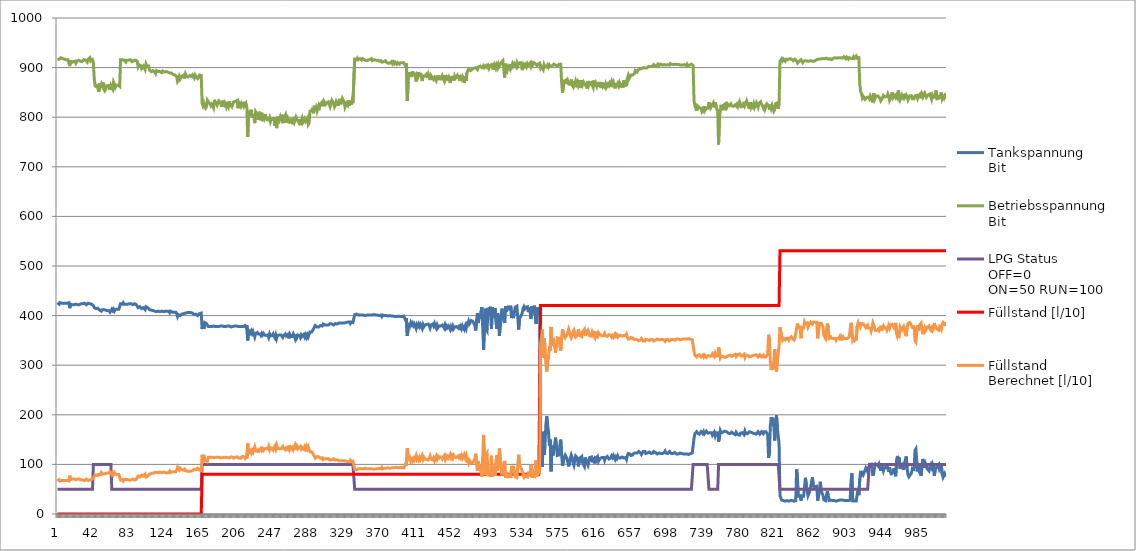
| Category | Tankspannung
Bit | Tank Buffer
Bit | Betriebsspannung
Bit | LPG Status 
OFF=0 
ON=50 RUN=100 | Füllstand [l/10] | Füllstand
Berechnet [l/10] |
|---|---|---|---|---|---|---|
| 0 | 426 |  | 916 | 50 | 0 | 66.474 |
| 1 | 424 |  | 918 | 50 | 0 | 68.422 |
| 2 | 423 |  | 917 | 50 | 0 | 69.413 |
| 3 | 426 |  | 918 | 50 | 0 | 66.458 |
| 4 | 424 |  | 920 | 50 | 0 | 68.406 |
| 5 | 425 |  | 919 | 50 | 0 | 67.432 |
| 6 | 426 |  | 918 | 50 | 0 | 66.458 |
| 7 | 425 |  | 920 | 50 | 0 | 67.424 |
| 8 | 426 |  | 917 | 50 | 0 | 66.466 |
| 9 | 425 |  | 917 | 50 | 0 | 67.448 |
| 10 | 425 |  | 916 | 50 | 0 | 67.456 |
| 11 | 425 |  | 918 | 50 | 0 | 67.44 |
| 12 | 424 |  | 916 | 50 | 0 | 68.439 |
| 13 | 426 |  | 918 | 50 | 0 | 66.458 |
| 14 | 415 |  | 903 | 50 | 0 | 77.384 |
| 15 | 423 |  | 915 | 50 | 0 | 69.429 |
| 16 | 421 |  | 910 | 50 | 0 | 71.435 |
| 17 | 422 |  | 912 | 50 | 0 | 70.436 |
| 18 | 420 |  | 912 | 50 | 0 | 72.4 |
| 19 | 422 |  | 910 | 50 | 0 | 70.453 |
| 20 | 423 |  | 913 | 50 | 0 | 69.446 |
| 21 | 423 |  | 909 | 50 | 0 | 69.479 |
| 22 | 423 |  | 913 | 50 | 0 | 69.446 |
| 23 | 422 |  | 915 | 50 | 0 | 70.411 |
| 24 | 423 |  | 915 | 50 | 0 | 69.429 |
| 25 | 422 |  | 916 | 50 | 0 | 70.403 |
| 26 | 422 |  | 913 | 50 | 0 | 70.428 |
| 27 | 424 |  | 914 | 50 | 0 | 68.455 |
| 28 | 422 |  | 912 | 50 | 0 | 70.436 |
| 29 | 424 |  | 913 | 50 | 0 | 68.463 |
| 30 | 423 |  | 916 | 50 | 0 | 69.421 |
| 31 | 425 |  | 915 | 50 | 0 | 67.465 |
| 32 | 424 |  | 915 | 50 | 0 | 68.447 |
| 33 | 422 |  | 915 | 50 | 0 | 70.411 |
| 34 | 421 |  | 911 | 50 | 0 | 71.426 |
| 35 | 425 |  | 917 | 50 | 0 | 67.448 |
| 36 | 424 |  | 917 | 50 | 0 | 68.43 |
| 37 | 424 |  | 920 | 50 | 0 | 68.406 |
| 38 | 423 |  | 913 | 50 | 0 | 69.446 |
| 39 | 423 |  | 914 | 50 | 0 | 69.437 |
| 40 | 425 |  | 916 | 50 | 0 | 67.456 |
| 41 | 420 |  | 910 | 100 | 0 | 72.417 |
| 42 | 416 |  | 877 | 100 | 0 | 76.621 |
| 43 | 415 |  | 863 | 100 | 0 | 77.722 |
| 44 | 414 |  | 862 | 100 | 0 | 78.713 |
| 45 | 413 |  | 861 | 100 | 0 | 79.703 |
| 46 | 415 |  | 867 | 100 | 0 | 77.688 |
| 47 | 413 |  | 851 | 100 | 0 | 79.788 |
| 48 | 411 |  | 868 | 100 | 0 | 81.608 |
| 49 | 413 |  | 861 | 100 | 0 | 79.703 |
| 50 | 409 |  | 866 | 100 | 0 | 83.589 |
| 51 | 412 |  | 860 | 100 | 0 | 80.694 |
| 52 | 411 |  | 870 | 100 | 0 | 81.591 |
| 53 | 412 |  | 856 | 100 | 0 | 80.728 |
| 54 | 411 |  | 853 | 100 | 0 | 81.736 |
| 55 | 411 |  | 856 | 100 | 0 | 81.71 |
| 56 | 411 |  | 863 | 100 | 0 | 81.651 |
| 57 | 410 |  | 864 | 100 | 0 | 82.624 |
| 58 | 412 |  | 861 | 100 | 0 | 80.686 |
| 59 | 410 |  | 866 | 100 | 0 | 82.607 |
| 60 | 407 |  | 855 | 100 | 0 | 85.647 |
| 61 | 409 |  | 864 | 100 | 0 | 83.606 |
| 62 | 413 |  | 865 | 50 | 0 | 79.669 |
| 63 | 410 |  | 857 | 50 | 0 | 82.684 |
| 64 | 413 |  | 871 | 50 | 0 | 79.619 |
| 65 | 409 |  | 867 | 50 | 0 | 83.581 |
| 66 | 412 |  | 860 | 50 | 0 | 80.694 |
| 67 | 413 |  | 864 | 50 | 0 | 79.678 |
| 68 | 413 |  | 866 | 50 | 0 | 79.661 |
| 69 | 411 |  | 865 | 50 | 0 | 81.634 |
| 70 | 413 |  | 866 | 50 | 0 | 79.661 |
| 71 | 413 |  | 862 | 50 | 0 | 79.695 |
| 72 | 424 |  | 916 | 50 | 0 | 68.439 |
| 73 | 424 |  | 915 | 50 | 0 | 68.447 |
| 74 | 423 |  | 916 | 50 | 0 | 69.421 |
| 75 | 426 |  | 914 | 50 | 0 | 66.491 |
| 76 | 423 |  | 915 | 50 | 0 | 69.429 |
| 77 | 423 |  | 915 | 50 | 0 | 69.429 |
| 78 | 423 |  | 911 | 50 | 0 | 69.462 |
| 79 | 423 |  | 915 | 50 | 0 | 69.429 |
| 80 | 423 |  | 914 | 50 | 0 | 69.437 |
| 81 | 423 |  | 915 | 50 | 0 | 69.429 |
| 82 | 424 |  | 915 | 50 | 0 | 68.447 |
| 83 | 423 |  | 916 | 50 | 0 | 69.421 |
| 84 | 424 |  | 916 | 50 | 0 | 68.439 |
| 85 | 423 |  | 912 | 50 | 0 | 69.454 |
| 86 | 422 |  | 914 | 50 | 0 | 70.419 |
| 87 | 423 |  | 914 | 50 | 0 | 69.437 |
| 88 | 424 |  | 912 | 50 | 0 | 68.472 |
| 89 | 424 |  | 915 | 50 | 0 | 68.447 |
| 90 | 422 |  | 915 | 50 | 0 | 70.411 |
| 91 | 423 |  | 913 | 50 | 0 | 69.446 |
| 92 | 416 |  | 902 | 50 | 0 | 76.411 |
| 93 | 416 |  | 906 | 50 | 0 | 76.377 |
| 94 | 418 |  | 906 | 50 | 0 | 74.414 |
| 95 | 416 |  | 904 | 50 | 0 | 76.394 |
| 96 | 414 |  | 898 | 50 | 0 | 78.408 |
| 97 | 413 |  | 896 | 50 | 0 | 79.407 |
| 98 | 416 |  | 903 | 50 | 0 | 76.403 |
| 99 | 414 |  | 902 | 50 | 0 | 78.374 |
| 100 | 412 |  | 896 | 50 | 0 | 80.388 |
| 101 | 418 |  | 907 | 50 | 0 | 74.406 |
| 102 | 418 |  | 903 | 50 | 0 | 74.439 |
| 103 | 416 |  | 901 | 50 | 0 | 76.419 |
| 104 | 416 |  | 903 | 50 | 0 | 76.403 |
| 105 | 412 |  | 895 | 50 | 0 | 80.397 |
| 106 | 412 |  | 894 | 50 | 0 | 80.405 |
| 107 | 411 |  | 892 | 50 | 0 | 81.404 |
| 108 | 410 |  | 894 | 50 | 0 | 82.368 |
| 109 | 410 |  | 894 | 50 | 0 | 82.368 |
| 110 | 409 |  | 895 | 50 | 0 | 83.341 |
| 111 | 409 |  | 891 | 50 | 0 | 83.375 |
| 112 | 410 |  | 888 | 50 | 0 | 82.42 |
| 113 | 408 |  | 894 | 50 | 0 | 84.331 |
| 114 | 408 |  | 892 | 50 | 0 | 84.348 |
| 115 | 409 |  | 892 | 50 | 0 | 83.367 |
| 116 | 411 |  | 891 | 50 | 0 | 81.412 |
| 117 | 408 |  | 892 | 50 | 0 | 84.348 |
| 118 | 408 |  | 892 | 50 | 0 | 84.348 |
| 119 | 409 |  | 890 | 50 | 0 | 83.384 |
| 120 | 409 |  | 893 | 50 | 0 | 83.358 |
| 121 | 408 |  | 892 | 50 | 0 | 84.348 |
| 122 | 409 |  | 891 | 50 | 0 | 83.375 |
| 123 | 409 |  | 892 | 50 | 0 | 83.367 |
| 124 | 410 |  | 892 | 50 | 0 | 82.385 |
| 125 | 409 |  | 893 | 50 | 0 | 83.358 |
| 126 | 408 |  | 891 | 50 | 0 | 84.357 |
| 127 | 409 |  | 891 | 50 | 0 | 83.375 |
| 128 | 406 |  | 889 | 50 | 0 | 86.336 |
| 129 | 409 |  | 891 | 50 | 0 | 83.375 |
| 130 | 408 |  | 889 | 50 | 0 | 84.374 |
| 131 | 407 |  | 888 | 50 | 0 | 85.364 |
| 132 | 407 |  | 886 | 50 | 0 | 85.381 |
| 133 | 407 |  | 884 | 50 | 0 | 85.398 |
| 134 | 407 |  | 885 | 50 | 0 | 85.389 |
| 135 | 407 |  | 887 | 50 | 0 | 85.372 |
| 136 | 404 |  | 882 | 50 | 0 | 88.359 |
| 137 | 398 |  | 872 | 50 | 0 | 94.332 |
| 138 | 402 |  | 875 | 50 | 0 | 90.382 |
| 139 | 404 |  | 882 | 50 | 0 | 88.359 |
| 140 | 400 |  | 877 | 50 | 0 | 92.326 |
| 141 | 402 |  | 877 | 50 | 0 | 90.364 |
| 142 | 403 |  | 883 | 50 | 0 | 89.331 |
| 143 | 402 |  | 882 | 50 | 0 | 90.321 |
| 144 | 404 |  | 885 | 50 | 0 | 88.333 |
| 145 | 402 |  | 878 | 50 | 0 | 90.356 |
| 146 | 405 |  | 887 | 50 | 0 | 87.335 |
| 147 | 403 |  | 883 | 50 | 0 | 89.331 |
| 148 | 406 |  | 885 | 50 | 0 | 86.371 |
| 149 | 405 |  | 881 | 50 | 0 | 87.386 |
| 150 | 406 |  | 882 | 50 | 0 | 86.397 |
| 151 | 405 |  | 884 | 50 | 0 | 87.36 |
| 152 | 406 |  | 883 | 50 | 0 | 86.388 |
| 153 | 404 |  | 882 | 50 | 0 | 88.359 |
| 154 | 405 |  | 885 | 50 | 0 | 87.352 |
| 155 | 403 |  | 884 | 50 | 0 | 89.323 |
| 156 | 402 |  | 879 | 50 | 0 | 90.347 |
| 157 | 402 |  | 885 | 50 | 0 | 90.295 |
| 158 | 403 |  | 882 | 50 | 0 | 89.34 |
| 159 | 402 |  | 882 | 50 | 0 | 90.321 |
| 160 | 400 |  | 878 | 50 | 0 | 92.317 |
| 161 | 401 |  | 881 | 50 | 0 | 91.31 |
| 162 | 404 |  | 885 | 50 | 0 | 88.333 |
| 163 | 404 |  | 885 | 50 | 0 | 88.333 |
| 164 | 405 |  | 884 | 50 | 0 | 87.36 |
| 165 | 373 |  | 828 | 100 | 80.3 | 119.231 |
| 166 | 387 |  | 823 | 100 | 80.3 | 105.557 |
| 167 | 373 |  | 828 | 100 | 80.3 | 119.231 |
| 168 | 386 |  | 821 | 100 | 80.3 | 106.556 |
| 169 | 386 |  | 818 | 100 | 80.3 | 106.583 |
| 170 | 384 |  | 821 | 100 | 80.3 | 108.517 |
| 171 | 386 |  | 834 | 100 | 80.3 | 106.438 |
| 172 | 378 |  | 831 | 100 | 80.3 | 114.306 |
| 173 | 377 |  | 830 | 100 | 80.3 | 115.294 |
| 174 | 378 |  | 827 | 100 | 80.3 | 114.343 |
| 175 | 378 |  | 823 | 100 | 80.3 | 114.38 |
| 176 | 378 |  | 826 | 100 | 80.3 | 114.352 |
| 177 | 379 |  | 823 | 100 | 80.3 | 113.4 |
| 178 | 379 |  | 819 | 100 | 80.3 | 113.437 |
| 179 | 379 |  | 835 | 100 | 80.3 | 113.289 |
| 180 | 378 |  | 830 | 100 | 80.3 | 114.315 |
| 181 | 377 |  | 829 | 100 | 80.3 | 115.304 |
| 182 | 378 |  | 824 | 100 | 80.3 | 114.37 |
| 183 | 378 |  | 823 | 100 | 80.3 | 114.38 |
| 184 | 378 |  | 833 | 100 | 80.3 | 114.287 |
| 185 | 378 |  | 833 | 100 | 80.3 | 114.287 |
| 186 | 379 |  | 830 | 100 | 80.3 | 113.335 |
| 187 | 378 |  | 821 | 100 | 80.3 | 114.398 |
| 188 | 379 |  | 831 | 100 | 80.3 | 113.326 |
| 189 | 379 |  | 829 | 100 | 80.3 | 113.344 |
| 190 | 378 |  | 832 | 100 | 80.3 | 114.296 |
| 191 | 379 |  | 820 | 100 | 80.3 | 113.427 |
| 192 | 378 |  | 831 | 100 | 80.3 | 114.306 |
| 193 | 379 |  | 821 | 100 | 80.3 | 113.418 |
| 194 | 379 |  | 825 | 100 | 80.3 | 113.381 |
| 195 | 380 |  | 821 | 100 | 80.3 | 112.438 |
| 196 | 379 |  | 832 | 100 | 80.3 | 113.317 |
| 197 | 379 |  | 826 | 100 | 80.3 | 113.372 |
| 198 | 377 |  | 824 | 100 | 80.3 | 115.35 |
| 199 | 379 |  | 821 | 100 | 80.3 | 113.418 |
| 200 | 378 |  | 823 | 100 | 80.3 | 114.38 |
| 201 | 380 |  | 831 | 100 | 80.3 | 112.346 |
| 202 | 379 |  | 832 | 100 | 80.3 | 113.317 |
| 203 | 378 |  | 832 | 100 | 80.3 | 114.296 |
| 204 | 379 |  | 833 | 100 | 80.3 | 113.307 |
| 205 | 377 |  | 834 | 100 | 80.3 | 115.257 |
| 206 | 378 |  | 818 | 100 | 80.3 | 114.426 |
| 207 | 380 |  | 829 | 100 | 80.3 | 112.364 |
| 208 | 378 |  | 828 | 100 | 80.3 | 114.333 |
| 209 | 380 |  | 822 | 100 | 80.3 | 112.429 |
| 210 | 378 |  | 828 | 100 | 80.3 | 114.333 |
| 211 | 376 |  | 829 | 100 | 80.3 | 116.283 |
| 212 | 378 |  | 822 | 100 | 80.3 | 114.389 |
| 213 | 377 |  | 831 | 100 | 80.3 | 115.285 |
| 214 | 380 |  | 825 | 100 | 80.3 | 112.401 |
| 215 | 377 |  | 828 | 100 | 80.3 | 115.313 |
| 216 | 381 |  | 821 | 100 | 80.3 | 111.458 |
| 217 | 350 |  | 760 | 100 | 80.3 | 142.4 |
| 218 | 370 |  | 806 | 100 | 80.3 | 122.376 |
| 219 | 371 |  | 813 | 100 | 80.3 | 121.33 |
| 220 | 365 |  | 803 | 100 | 80.3 | 127.3 |
| 221 | 369 |  | 815 | 100 | 80.3 | 123.27 |
| 222 | 364 |  | 802 | 100 | 80.3 | 128.288 |
| 223 | 368 |  | 800 | 100 | 80.3 | 124.391 |
| 224 | 367 |  | 803 | 100 | 80.3 | 125.342 |
| 225 | 357 |  | 788 | 100 | 80.3 | 135.275 |
| 226 | 364 |  | 811 | 100 | 80.3 | 128.202 |
| 227 | 362 |  | 808 | 100 | 80.3 | 130.188 |
| 228 | 366 |  | 805 | 100 | 80.3 | 126.302 |
| 229 | 363 |  | 795 | 100 | 80.3 | 129.335 |
| 230 | 365 |  | 811 | 100 | 80.3 | 127.223 |
| 231 | 363 |  | 809 | 100 | 80.3 | 129.2 |
| 232 | 360 |  | 794 | 100 | 80.3 | 132.281 |
| 233 | 364 |  | 809 | 100 | 80.3 | 128.221 |
| 234 | 361 |  | 792 | 100 | 80.3 | 131.321 |
| 235 | 364 |  | 805 | 100 | 80.3 | 128.26 |
| 236 | 361 |  | 799 | 100 | 80.3 | 131.253 |
| 237 | 361 |  | 806 | 100 | 80.3 | 131.186 |
| 238 | 360 |  | 798 | 100 | 80.3 | 132.242 |
| 239 | 361 |  | 795 | 100 | 80.3 | 131.292 |
| 240 | 361 |  | 797 | 100 | 80.3 | 131.273 |
| 241 | 356 |  | 794 | 100 | 80.3 | 136.194 |
| 242 | 363 |  | 799 | 100 | 80.3 | 129.296 |
| 243 | 359 |  | 791 | 100 | 80.3 | 133.288 |
| 244 | 360 |  | 796 | 100 | 80.3 | 132.261 |
| 245 | 360 |  | 797 | 100 | 80.3 | 132.251 |
| 246 | 363 |  | 796 | 100 | 80.3 | 129.325 |
| 247 | 358 |  | 800 | 100 | 80.3 | 134.179 |
| 248 | 355 |  | 783 | 100 | 80.3 | 137.28 |
| 249 | 361 |  | 800 | 100 | 80.3 | 131.244 |
| 250 | 354 |  | 778 | 100 | 80.3 | 138.308 |
| 251 | 360 |  | 801 | 100 | 80.3 | 132.212 |
| 252 | 360 |  | 788 | 100 | 80.3 | 132.339 |
| 253 | 361 |  | 794 | 100 | 80.3 | 131.302 |
| 254 | 359 |  | 800 | 100 | 80.3 | 133.201 |
| 255 | 361 |  | 793 | 100 | 80.3 | 131.312 |
| 256 | 360 |  | 805 | 100 | 80.3 | 132.174 |
| 257 | 356 |  | 788 | 100 | 80.3 | 136.253 |
| 258 | 360 |  | 796 | 100 | 80.3 | 132.261 |
| 259 | 358 |  | 798 | 100 | 80.3 | 134.198 |
| 260 | 363 |  | 804 | 100 | 80.3 | 129.248 |
| 261 | 359 |  | 789 | 100 | 80.3 | 133.308 |
| 262 | 360 |  | 801 | 100 | 80.3 | 132.212 |
| 263 | 362 |  | 798 | 100 | 80.3 | 130.285 |
| 264 | 354 |  | 790 | 100 | 80.3 | 138.189 |
| 265 | 362 |  | 792 | 100 | 80.3 | 130.343 |
| 266 | 358 |  | 790 | 100 | 80.3 | 134.277 |
| 267 | 360 |  | 798 | 100 | 80.3 | 132.242 |
| 268 | 358 |  | 786 | 100 | 80.3 | 134.316 |
| 269 | 363 |  | 793 | 100 | 80.3 | 129.354 |
| 270 | 359 |  | 789 | 100 | 80.3 | 133.308 |
| 271 | 354 |  | 791 | 100 | 80.3 | 138.179 |
| 272 | 362 |  | 800 | 100 | 80.3 | 130.265 |
| 273 | 356 |  | 796 | 100 | 80.3 | 136.174 |
| 274 | 361 |  | 797 | 100 | 80.3 | 131.273 |
| 275 | 359 |  | 790 | 100 | 80.3 | 133.298 |
| 276 | 360 |  | 796 | 100 | 80.3 | 132.261 |
| 277 | 356 |  | 784 | 100 | 80.3 | 136.292 |
| 278 | 361 |  | 793 | 100 | 80.3 | 131.312 |
| 279 | 358 |  | 798 | 100 | 80.3 | 134.198 |
| 280 | 358 |  | 790 | 100 | 80.3 | 134.277 |
| 281 | 362 |  | 788 | 100 | 80.3 | 130.381 |
| 282 | 357 |  | 797 | 100 | 80.3 | 135.186 |
| 283 | 361 |  | 792 | 100 | 80.3 | 131.321 |
| 284 | 356 |  | 793 | 100 | 80.3 | 136.204 |
| 285 | 361 |  | 798 | 100 | 80.3 | 131.263 |
| 286 | 357 |  | 785 | 100 | 80.3 | 135.304 |
| 287 | 358 |  | 788 | 100 | 80.3 | 134.296 |
| 288 | 367 |  | 812 | 100 | 80.3 | 125.256 |
| 289 | 368 |  | 813 | 100 | 80.3 | 124.268 |
| 290 | 367 |  | 813 | 100 | 80.3 | 125.247 |
| 291 | 370 |  | 819 | 100 | 80.3 | 122.253 |
| 292 | 373 |  | 808 | 100 | 80.3 | 119.418 |
| 293 | 374 |  | 823 | 100 | 80.3 | 118.298 |
| 294 | 380 |  | 813 | 100 | 80.3 | 112.512 |
| 295 | 378 |  | 819 | 100 | 80.3 | 114.417 |
| 296 | 377 |  | 812 | 100 | 80.3 | 115.462 |
| 297 | 379 |  | 818 | 100 | 80.3 | 113.446 |
| 298 | 377 |  | 824 | 100 | 80.3 | 115.35 |
| 299 | 379 |  | 820 | 100 | 80.3 | 113.427 |
| 300 | 380 |  | 827 | 100 | 80.3 | 112.383 |
| 301 | 379 |  | 825 | 100 | 80.3 | 113.381 |
| 302 | 379 |  | 831 | 100 | 80.3 | 113.326 |
| 303 | 383 |  | 822 | 100 | 80.3 | 109.488 |
| 304 | 381 |  | 832 | 100 | 80.3 | 111.357 |
| 305 | 381 |  | 829 | 100 | 80.3 | 111.385 |
| 306 | 382 |  | 826 | 100 | 80.3 | 110.432 |
| 307 | 381 |  | 829 | 100 | 80.3 | 111.385 |
| 308 | 381 |  | 827 | 100 | 80.3 | 111.403 |
| 309 | 381 |  | 831 | 100 | 80.3 | 111.366 |
| 310 | 383 |  | 826 | 100 | 80.3 | 109.452 |
| 311 | 384 |  | 821 | 100 | 80.3 | 108.517 |
| 312 | 383 |  | 827 | 100 | 80.3 | 109.443 |
| 313 | 383 |  | 834 | 100 | 80.3 | 109.379 |
| 314 | 384 |  | 832 | 100 | 80.3 | 108.417 |
| 315 | 381 |  | 828 | 100 | 80.3 | 111.394 |
| 316 | 383 |  | 821 | 100 | 80.3 | 109.497 |
| 317 | 384 |  | 825 | 100 | 80.3 | 108.48 |
| 318 | 382 |  | 832 | 100 | 80.3 | 110.377 |
| 319 | 383 |  | 829 | 100 | 80.3 | 109.424 |
| 320 | 383 |  | 823 | 100 | 80.3 | 109.479 |
| 321 | 385 |  | 831 | 100 | 80.3 | 107.445 |
| 322 | 383 |  | 837 | 100 | 80.3 | 109.351 |
| 323 | 385 |  | 826 | 100 | 80.3 | 107.491 |
| 324 | 386 |  | 824 | 100 | 80.3 | 106.528 |
| 325 | 385 |  | 838 | 100 | 80.3 | 107.382 |
| 326 | 386 |  | 836 | 100 | 80.3 | 106.42 |
| 327 | 385 |  | 831 | 100 | 80.3 | 107.445 |
| 328 | 387 |  | 820 | 100 | 80.3 | 105.584 |
| 329 | 386 |  | 824 | 100 | 80.3 | 106.528 |
| 330 | 387 |  | 828 | 100 | 80.3 | 105.512 |
| 331 | 387 |  | 825 | 100 | 80.3 | 105.539 |
| 332 | 385 |  | 834 | 100 | 80.3 | 107.418 |
| 333 | 387 |  | 823 | 100 | 80.3 | 105.557 |
| 334 | 384 |  | 833 | 100 | 80.3 | 108.408 |
| 335 | 387 |  | 825 | 100 | 80.3 | 105.539 |
| 336 | 385 |  | 833 | 100 | 80.3 | 107.427 |
| 337 | 386 |  | 828 | 100 | 80.3 | 106.492 |
| 338 | 386 |  | 830 | 100 | 80.3 | 106.474 |
| 339 | 402 |  | 917 | 50 | 80.3 | 90.016 |
| 340 | 401 |  | 918 | 50 | 80.3 | 90.988 |
| 341 | 403 |  | 916 | 50 | 80.3 | 89.045 |
| 342 | 403 |  | 919 | 50 | 80.3 | 89.019 |
| 343 | 401 |  | 916 | 50 | 80.3 | 91.005 |
| 344 | 401 |  | 917 | 50 | 80.3 | 90.996 |
| 345 | 401 |  | 918 | 50 | 80.3 | 90.988 |
| 346 | 401 |  | 916 | 50 | 80.3 | 91.005 |
| 347 | 401 |  | 915 | 50 | 80.3 | 91.014 |
| 348 | 401 |  | 918 | 50 | 80.3 | 90.988 |
| 349 | 401 |  | 918 | 50 | 80.3 | 90.988 |
| 350 | 401 |  | 916 | 50 | 80.3 | 91.005 |
| 351 | 400 |  | 916 | 50 | 80.3 | 91.985 |
| 352 | 400 |  | 914 | 50 | 80.3 | 92.002 |
| 353 | 401 |  | 915 | 50 | 80.3 | 91.014 |
| 354 | 401 |  | 915 | 50 | 80.3 | 91.014 |
| 355 | 401 |  | 914 | 50 | 80.3 | 91.022 |
| 356 | 401 |  | 916 | 50 | 80.3 | 91.005 |
| 357 | 401 |  | 916 | 50 | 80.3 | 91.005 |
| 358 | 400 |  | 918 | 50 | 80.3 | 91.967 |
| 359 | 401 |  | 914 | 50 | 80.3 | 91.022 |
| 360 | 400 |  | 915 | 50 | 80.3 | 91.994 |
| 361 | 402 |  | 916 | 50 | 80.3 | 90.025 |
| 362 | 400 |  | 917 | 50 | 80.3 | 91.976 |
| 363 | 401 |  | 915 | 50 | 80.3 | 91.014 |
| 364 | 401 |  | 915 | 50 | 80.3 | 91.014 |
| 365 | 401 |  | 915 | 50 | 80.3 | 91.014 |
| 366 | 401 |  | 914 | 50 | 80.3 | 91.022 |
| 367 | 400 |  | 913 | 50 | 80.3 | 92.011 |
| 368 | 400 |  | 915 | 50 | 80.3 | 91.994 |
| 369 | 401 |  | 914 | 50 | 80.3 | 91.022 |
| 370 | 398 |  | 911 | 50 | 80.3 | 93.989 |
| 371 | 401 |  | 913 | 50 | 80.3 | 91.031 |
| 372 | 400 |  | 912 | 50 | 80.3 | 92.02 |
| 373 | 400 |  | 911 | 50 | 80.3 | 92.029 |
| 374 | 399 |  | 914 | 50 | 80.3 | 92.982 |
| 375 | 400 |  | 911 | 50 | 80.3 | 92.029 |
| 376 | 400 |  | 910 | 50 | 80.3 | 92.038 |
| 377 | 399 |  | 909 | 50 | 80.3 | 93.026 |
| 378 | 398 |  | 911 | 50 | 80.3 | 93.989 |
| 379 | 400 |  | 909 | 50 | 80.3 | 92.046 |
| 380 | 400 |  | 910 | 50 | 80.3 | 92.038 |
| 381 | 399 |  | 912 | 50 | 80.3 | 93 |
| 382 | 400 |  | 908 | 50 | 80.3 | 92.055 |
| 383 | 399 |  | 911 | 50 | 80.3 | 93.009 |
| 384 | 398 |  | 908 | 50 | 80.3 | 94.015 |
| 385 | 398 |  | 911 | 50 | 80.3 | 93.989 |
| 386 | 398 |  | 909 | 50 | 80.3 | 94.006 |
| 387 | 398 |  | 907 | 50 | 80.3 | 94.024 |
| 388 | 400 |  | 910 | 50 | 80.3 | 92.038 |
| 389 | 399 |  | 910 | 50 | 80.3 | 93.018 |
| 390 | 397 |  | 907 | 50 | 80.3 | 95.004 |
| 391 | 398 |  | 910 | 50 | 80.3 | 93.997 |
| 392 | 398 |  | 909 | 50 | 80.3 | 94.006 |
| 393 | 398 |  | 910 | 50 | 80.3 | 93.997 |
| 394 | 397 |  | 909 | 50 | 80.3 | 94.986 |
| 395 | 399 |  | 910 | 50 | 80.3 | 93.018 |
| 396 | 395 |  | 910 | 50 | 80.3 | 96.937 |
| 397 | 391 |  | 903 | 50 | 80.3 | 100.917 |
| 398 | 395 |  | 909 | 50 | 80.3 | 96.946 |
| 399 | 359 |  | 833 | 50 | 80.3 | 132.879 |
| 400 | 374 |  | 871 | 50 | 80.3 | 117.849 |
| 401 | 385 |  | 891 | 50 | 80.3 | 106.9 |
| 402 | 380 |  | 882 | 50 | 80.3 | 111.876 |
| 403 | 386 |  | 889 | 50 | 80.3 | 105.939 |
| 404 | 382 |  | 881 | 50 | 80.3 | 109.928 |
| 405 | 385 |  | 892 | 50 | 80.3 | 106.891 |
| 406 | 380 |  | 887 | 50 | 80.3 | 111.83 |
| 407 | 383 |  | 886 | 50 | 80.3 | 108.903 |
| 408 | 383 |  | 887 | 50 | 80.3 | 108.894 |
| 409 | 374 |  | 872 | 50 | 80.3 | 117.84 |
| 410 | 382 |  | 885 | 50 | 80.3 | 109.891 |
| 411 | 379 |  | 882 | 50 | 80.3 | 112.855 |
| 412 | 383 |  | 891 | 50 | 80.3 | 108.858 |
| 413 | 378 |  | 881 | 50 | 80.3 | 113.843 |
| 414 | 382 |  | 889 | 50 | 80.3 | 109.855 |
| 415 | 378 |  | 882 | 50 | 80.3 | 113.833 |
| 416 | 374 |  | 873 | 50 | 80.3 | 117.83 |
| 417 | 382 |  | 883 | 50 | 80.3 | 109.91 |
| 418 | 378 |  | 883 | 50 | 80.3 | 113.824 |
| 419 | 381 |  | 883 | 50 | 80.3 | 110.888 |
| 420 | 380 |  | 882 | 50 | 80.3 | 111.876 |
| 421 | 382 |  | 887 | 50 | 80.3 | 109.873 |
| 422 | 382 |  | 879 | 50 | 80.3 | 109.946 |
| 423 | 383 |  | 886 | 50 | 80.3 | 108.903 |
| 424 | 380 |  | 886 | 50 | 80.3 | 111.839 |
| 425 | 375 |  | 875 | 50 | 80.3 | 116.833 |
| 426 | 381 |  | 884 | 50 | 80.3 | 110.879 |
| 427 | 380 |  | 881 | 50 | 80.3 | 111.886 |
| 428 | 383 |  | 882 | 50 | 80.3 | 108.94 |
| 429 | 379 |  | 876 | 50 | 80.3 | 112.91 |
| 430 | 384 |  | 880 | 50 | 80.3 | 107.979 |
| 431 | 379 |  | 878 | 50 | 80.3 | 112.892 |
| 432 | 375 |  | 874 | 50 | 80.3 | 116.843 |
| 433 | 381 |  | 884 | 50 | 80.3 | 110.879 |
| 434 | 376 |  | 876 | 50 | 80.3 | 115.846 |
| 435 | 379 |  | 884 | 50 | 80.3 | 112.836 |
| 436 | 377 |  | 877 | 50 | 80.3 | 114.858 |
| 437 | 379 |  | 879 | 50 | 80.3 | 112.883 |
| 438 | 377 |  | 877 | 50 | 80.3 | 114.858 |
| 439 | 381 |  | 883 | 50 | 80.3 | 110.888 |
| 440 | 381 |  | 885 | 50 | 80.3 | 110.87 |
| 441 | 375 |  | 874 | 50 | 80.3 | 116.843 |
| 442 | 381 |  | 885 | 50 | 80.3 | 110.87 |
| 443 | 375 |  | 877 | 50 | 80.3 | 116.815 |
| 444 | 379 |  | 881 | 50 | 80.3 | 112.864 |
| 445 | 376 |  | 878 | 50 | 80.3 | 115.827 |
| 446 | 379 |  | 881 | 50 | 80.3 | 112.864 |
| 447 | 376 |  | 875 | 50 | 80.3 | 115.855 |
| 448 | 372 |  | 869 | 50 | 80.3 | 119.824 |
| 449 | 378 |  | 883 | 50 | 80.3 | 113.824 |
| 450 | 374 |  | 876 | 50 | 80.3 | 117.802 |
| 451 | 379 |  | 883 | 50 | 80.3 | 112.846 |
| 452 | 374 |  | 874 | 50 | 80.3 | 117.821 |
| 453 | 377 |  | 883 | 50 | 80.3 | 114.802 |
| 454 | 375 |  | 879 | 50 | 80.3 | 116.796 |
| 455 | 378 |  | 881 | 50 | 80.3 | 113.843 |
| 456 | 379 |  | 884 | 50 | 80.3 | 112.836 |
| 457 | 375 |  | 877 | 50 | 80.3 | 116.815 |
| 458 | 378 |  | 885 | 50 | 80.3 | 113.806 |
| 459 | 375 |  | 873 | 50 | 80.3 | 116.852 |
| 460 | 379 |  | 880 | 50 | 80.3 | 112.873 |
| 461 | 374 |  | 877 | 50 | 80.3 | 117.793 |
| 462 | 379 |  | 882 | 50 | 80.3 | 112.855 |
| 463 | 377 |  | 878 | 50 | 80.3 | 114.849 |
| 464 | 372 |  | 869 | 50 | 80.3 | 119.824 |
| 465 | 378 |  | 883 | 50 | 80.3 | 113.824 |
| 466 | 374 |  | 873 | 50 | 80.3 | 117.83 |
| 467 | 388 |  | 890 | 50 | 80.3 | 103.972 |
| 468 | 383 |  | 889 | 50 | 80.3 | 108.876 |
| 469 | 389 |  | 897 | 50 | 80.3 | 102.929 |
| 470 | 384 |  | 895 | 50 | 80.3 | 107.842 |
| 471 | 384 |  | 894 | 50 | 80.3 | 107.852 |
| 472 | 390 |  | 896 | 50 | 80.3 | 101.959 |
| 473 | 389 |  | 897 | 50 | 80.3 | 102.929 |
| 474 | 388 |  | 897 | 50 | 80.3 | 103.909 |
| 475 | 390 |  | 899 | 50 | 80.3 | 101.932 |
| 476 | 380 |  | 897 | 50 | 80.3 | 111.738 |
| 477 | 370 |  | 900 | 50 | 80.3 | 121.486 |
| 478 | 391 |  | 899 | 50 | 80.3 | 100.953 |
| 479 | 405 |  | 896 | 50 | 80.3 | 87.257 |
| 480 | 385 |  | 901 | 50 | 80.3 | 106.809 |
| 481 | 400 |  | 901 | 50 | 80.3 | 92.116 |
| 482 | 394 |  | 903 | 50 | 80.3 | 97.978 |
| 483 | 395 |  | 905 | 50 | 80.3 | 96.981 |
| 484 | 417 |  | 900 | 50 | 80.3 | 75.446 |
| 485 | 379 |  | 901 | 50 | 80.3 | 112.679 |
| 486 | 331 |  | 904 | 50 | 80.3 | 159.441 |
| 487 | 380 |  | 900 | 50 | 80.3 | 111.711 |
| 488 | 414 |  | 901 | 50 | 80.3 | 78.383 |
| 489 | 372 |  | 904 | 50 | 80.3 | 119.495 |
| 490 | 369 |  | 901 | 50 | 80.3 | 122.454 |
| 491 | 416 |  | 904 | 50 | 80.3 | 76.394 |
| 492 | 416 |  | 899 | 50 | 80.3 | 76.436 |
| 493 | 408 |  | 904 | 50 | 80.3 | 84.245 |
| 494 | 418 |  | 905 | 50 | 80.3 | 74.422 |
| 495 | 374 |  | 906 | 50 | 80.3 | 117.521 |
| 496 | 417 |  | 901 | 50 | 80.3 | 75.438 |
| 497 | 417 |  | 904 | 50 | 80.3 | 75.412 |
| 498 | 397 |  | 896 | 50 | 80.3 | 95.101 |
| 499 | 415 |  | 904 | 50 | 80.3 | 77.376 |
| 500 | 416 |  | 899 | 50 | 80.3 | 76.436 |
| 501 | 373 |  | 905 | 50 | 80.3 | 118.508 |
| 502 | 405 |  | 900 | 50 | 80.3 | 87.222 |
| 503 | 396 |  | 907 | 50 | 80.3 | 95.984 |
| 504 | 359 |  | 903 | 50 | 80.3 | 132.196 |
| 505 | 360 |  | 905 | 50 | 80.3 | 131.201 |
| 506 | 400 |  | 910 | 50 | 80.3 | 92.038 |
| 507 | 414 |  | 912 | 50 | 80.3 | 78.29 |
| 508 | 397 |  | 914 | 50 | 80.3 | 94.942 |
| 509 | 397 |  | 914 | 50 | 80.3 | 94.942 |
| 510 | 385 |  | 880 | 50 | 80.3 | 107 |
| 511 | 419 |  | 908 | 50 | 80.3 | 73.415 |
| 512 | 408 |  | 887 | 50 | 80.3 | 84.391 |
| 513 | 413 |  | 899 | 50 | 80.3 | 79.381 |
| 514 | 417 |  | 903 | 50 | 80.3 | 75.421 |
| 515 | 418 |  | 904 | 50 | 80.3 | 74.431 |
| 516 | 414 |  | 897 | 50 | 80.3 | 78.417 |
| 517 | 420 |  | 907 | 50 | 80.3 | 72.442 |
| 518 | 395 |  | 902 | 50 | 80.3 | 97.008 |
| 519 | 408 |  | 908 | 50 | 80.3 | 84.211 |
| 520 | 395 |  | 904 | 50 | 80.3 | 96.99 |
| 521 | 407 |  | 908 | 50 | 80.3 | 85.192 |
| 522 | 417 |  | 905 | 50 | 80.3 | 75.404 |
| 523 | 415 |  | 902 | 50 | 80.3 | 77.393 |
| 524 | 419 |  | 909 | 50 | 80.3 | 73.407 |
| 525 | 417 |  | 903 | 50 | 80.3 | 75.421 |
| 526 | 372 |  | 907 | 50 | 80.3 | 119.466 |
| 527 | 394 |  | 910 | 50 | 80.3 | 97.916 |
| 528 | 397 |  | 908 | 50 | 80.3 | 94.995 |
| 529 | 397 |  | 910 | 50 | 80.3 | 94.977 |
| 530 | 405 |  | 895 | 50 | 80.3 | 87.265 |
| 531 | 414 |  | 901 | 50 | 80.3 | 78.383 |
| 532 | 418 |  | 906 | 50 | 80.3 | 74.414 |
| 533 | 414 |  | 903 | 50 | 80.3 | 78.366 |
| 534 | 417 |  | 906 | 50 | 80.3 | 75.396 |
| 535 | 415 |  | 902 | 50 | 80.3 | 77.393 |
| 536 | 418 |  | 908 | 50 | 80.3 | 74.397 |
| 537 | 407 |  | 905 | 50 | 80.3 | 85.217 |
| 538 | 417 |  | 906 | 50 | 80.3 | 75.396 |
| 539 | 411 |  | 909 | 50 | 80.3 | 81.259 |
| 540 | 393 |  | 903 | 50 | 80.3 | 98.958 |
| 541 | 419 |  | 909 | 50 | 80.3 | 73.407 |
| 542 | 417 |  | 906 | 50 | 80.3 | 75.396 |
| 543 | 410 |  | 910 | 50 | 80.3 | 82.232 |
| 544 | 420 |  | 909 | 50 | 80.3 | 72.425 |
| 545 | 419 |  | 908 | 50 | 80.3 | 73.415 |
| 546 | 383 |  | 909 | 50 | 80.3 | 108.693 |
| 547 | 417 |  | 904 | 50 | 80.3 | 75.412 |
| 548 | 407 |  | 907 | 50 | 80.3 | 85.2 |
| 549 | 412 |  | 908 | 50 | 80.3 | 80.286 |
| 550 | 399 |  | 909 | 50 | 80.3 | 93.026 |
| 551 | 133 |  | 899 | 50 | 420.6 | 343.342 |
| 552 | 117 |  | 902 | 50 | 420.6 | 356.017 |
| 553 | 95 |  | 901 | 50 | 420.6 | 371.805 |
| 554 | 166 |  | 896 | 50 | 420.6 | 315.108 |
| 555 | 119 |  | 906 | 50 | 420.6 | 354.353 |
| 556 | 138 |  | 902 | 50 | 420.6 | 339.123 |
| 557 | 179 |  | 904 | 50 | 420.6 | 303.324 |
| 558 | 197 |  | 901 | 50 | 420.6 | 286.992 |
| 559 | 180 |  | 905 | 50 | 420.6 | 302.403 |
| 560 | 166 |  | 901 | 50 | 420.6 | 315.003 |
| 561 | 138 |  | 905 | 50 | 420.6 | 339.047 |
| 562 | 150 |  | 902 | 50 | 420.6 | 328.953 |
| 563 | 86 |  | 904 | 50 | 420.6 | 377.209 |
| 564 | 138 |  | 903 | 50 | 420.6 | 339.098 |
| 565 | 118 |  | 903 | 50 | 420.6 | 355.216 |
| 566 | 119 |  | 907 | 50 | 420.6 | 354.324 |
| 567 | 139 |  | 905 | 50 | 420.6 | 338.212 |
| 568 | 154 |  | 905 | 50 | 420.6 | 325.432 |
| 569 | 138 |  | 905 | 50 | 420.6 | 339.047 |
| 570 | 118 |  | 903 | 50 | 420.6 | 355.216 |
| 571 | 118 |  | 904 | 50 | 420.6 | 355.186 |
| 572 | 119 |  | 907 | 50 | 420.6 | 354.324 |
| 573 | 139 |  | 905 | 50 | 420.6 | 338.212 |
| 574 | 150 |  | 907 | 50 | 420.6 | 328.837 |
| 575 | 119 |  | 871 | 50 | 420.6 | 355.382 |
| 576 | 97 |  | 849 | 50 | 420.6 | 372.366 |
| 577 | 97 |  | 862 | 50 | 420.6 | 371.897 |
| 578 | 115 |  | 873 | 50 | 420.6 | 358.43 |
| 579 | 119 |  | 875 | 50 | 420.6 | 355.265 |
| 580 | 120 |  | 875 | 50 | 420.6 | 354.479 |
| 581 | 112 |  | 867 | 50 | 420.6 | 360.906 |
| 582 | 110 |  | 873 | 50 | 420.6 | 362.223 |
| 583 | 96 |  | 867 | 50 | 420.6 | 372.391 |
| 584 | 97 |  | 866 | 50 | 420.6 | 371.753 |
| 585 | 113 |  | 866 | 50 | 420.6 | 360.177 |
| 586 | 119 |  | 876 | 50 | 420.6 | 355.235 |
| 587 | 114 |  | 865 | 50 | 420.6 | 359.443 |
| 588 | 103 |  | 862 | 50 | 420.6 | 367.709 |
| 589 | 98 |  | 873 | 50 | 420.6 | 370.821 |
| 590 | 100 |  | 867 | 50 | 420.6 | 369.655 |
| 591 | 117 |  | 873 | 50 | 420.6 | 356.885 |
| 592 | 117 |  | 867 | 50 | 420.6 | 357.064 |
| 593 | 113 |  | 871 | 50 | 420.6 | 360.022 |
| 594 | 96 |  | 864 | 50 | 420.6 | 372.5 |
| 595 | 98 |  | 869 | 50 | 420.6 | 370.964 |
| 596 | 113 |  | 875 | 50 | 420.6 | 359.898 |
| 597 | 112 |  | 859 | 50 | 420.6 | 361.156 |
| 598 | 116 |  | 874 | 50 | 420.6 | 357.629 |
| 599 | 103 |  | 866 | 50 | 420.6 | 367.573 |
| 600 | 104 |  | 871 | 50 | 420.6 | 366.688 |
| 601 | 96 |  | 868 | 50 | 420.6 | 372.354 |
| 602 | 114 |  | 870 | 50 | 420.6 | 359.289 |
| 603 | 112 |  | 863 | 50 | 420.6 | 361.031 |
| 604 | 102 |  | 858 | 50 | 420.6 | 368.559 |
| 605 | 98 |  | 873 | 50 | 420.6 | 370.821 |
| 606 | 106 |  | 864 | 50 | 420.6 | 365.472 |
| 607 | 114 |  | 868 | 50 | 420.6 | 359.351 |
| 608 | 115 |  | 866 | 50 | 420.6 | 358.643 |
| 609 | 115 |  | 870 | 50 | 420.6 | 358.522 |
| 610 | 104 |  | 864 | 50 | 420.6 | 366.923 |
| 611 | 102 |  | 860 | 50 | 420.6 | 368.49 |
| 612 | 114 |  | 874 | 50 | 420.6 | 359.167 |
| 613 | 102 |  | 862 | 50 | 420.6 | 368.422 |
| 614 | 117 |  | 868 | 50 | 420.6 | 357.034 |
| 615 | 112 |  | 863 | 50 | 420.6 | 361.031 |
| 616 | 115 |  | 871 | 50 | 420.6 | 358.491 |
| 617 | 106 |  | 861 | 50 | 420.6 | 365.571 |
| 618 | 109 |  | 871 | 50 | 420.6 | 363.032 |
| 619 | 112 |  | 864 | 50 | 420.6 | 361 |
| 620 | 110 |  | 859 | 50 | 420.6 | 362.668 |
| 621 | 114 |  | 870 | 50 | 420.6 | 359.289 |
| 622 | 115 |  | 862 | 50 | 420.6 | 358.765 |
| 623 | 114 |  | 865 | 50 | 420.6 | 359.443 |
| 624 | 108 |  | 862 | 50 | 420.6 | 364.065 |
| 625 | 113 |  | 867 | 50 | 420.6 | 360.146 |
| 626 | 113 |  | 860 | 50 | 420.6 | 360.363 |
| 627 | 116 |  | 858 | 50 | 420.6 | 358.112 |
| 628 | 115 |  | 867 | 50 | 420.6 | 358.613 |
| 629 | 111 |  | 864 | 50 | 420.6 | 361.757 |
| 630 | 112 |  | 869 | 50 | 420.6 | 360.844 |
| 631 | 113 |  | 866 | 50 | 420.6 | 360.177 |
| 632 | 117 |  | 872 | 50 | 420.6 | 356.915 |
| 633 | 114 |  | 867 | 50 | 420.6 | 359.382 |
| 634 | 118 |  | 871 | 50 | 420.6 | 356.165 |
| 635 | 114 |  | 869 | 50 | 420.6 | 359.32 |
| 636 | 110 |  | 858 | 50 | 420.6 | 362.7 |
| 637 | 115 |  | 869 | 50 | 420.6 | 358.552 |
| 638 | 112 |  | 861 | 50 | 420.6 | 361.094 |
| 639 | 117 |  | 867 | 50 | 420.6 | 357.064 |
| 640 | 113 |  | 863 | 50 | 420.6 | 360.27 |
| 641 | 115 |  | 870 | 50 | 420.6 | 358.522 |
| 642 | 113 |  | 866 | 50 | 420.6 | 360.177 |
| 643 | 112 |  | 860 | 50 | 420.6 | 361.125 |
| 644 | 115 |  | 868 | 50 | 420.6 | 358.583 |
| 645 | 114 |  | 860 | 50 | 420.6 | 359.596 |
| 646 | 113 |  | 874 | 50 | 420.6 | 359.929 |
| 647 | 113 |  | 861 | 50 | 420.6 | 360.332 |
| 648 | 114 |  | 871 | 50 | 420.6 | 359.259 |
| 649 | 110 |  | 863 | 50 | 420.6 | 362.541 |
| 650 | 118 |  | 878 | 50 | 420.6 | 355.958 |
| 651 | 122 |  | 884 | 50 | 420.6 | 352.639 |
| 652 | 120 |  | 878 | 50 | 420.6 | 354.392 |
| 653 | 121 |  | 881 | 50 | 420.6 | 353.517 |
| 654 | 118 |  | 885 | 50 | 420.6 | 355.75 |
| 655 | 119 |  | 887 | 50 | 420.6 | 354.912 |
| 656 | 119 |  | 885 | 50 | 420.6 | 354.971 |
| 657 | 122 |  | 886 | 50 | 420.6 | 352.582 |
| 658 | 124 |  | 888 | 50 | 420.6 | 350.935 |
| 659 | 123 |  | 894 | 50 | 420.6 | 351.561 |
| 660 | 121 |  | 893 | 50 | 420.6 | 353.169 |
| 661 | 123 |  | 891 | 50 | 420.6 | 351.646 |
| 662 | 124 |  | 895 | 50 | 420.6 | 350.738 |
| 663 | 126 |  | 897 | 50 | 420.6 | 349.083 |
| 664 | 126 |  | 897 | 50 | 420.6 | 349.083 |
| 665 | 123 |  | 896 | 50 | 420.6 | 351.504 |
| 666 | 120 |  | 898 | 50 | 420.6 | 353.808 |
| 667 | 123 |  | 900 | 50 | 420.6 | 351.39 |
| 668 | 126 |  | 900 | 50 | 420.6 | 349 |
| 669 | 125 |  | 899 | 50 | 420.6 | 349.828 |
| 670 | 126 |  | 899 | 50 | 420.6 | 349.028 |
| 671 | 122 |  | 898 | 50 | 420.6 | 352.238 |
| 672 | 123 |  | 899 | 50 | 420.6 | 351.419 |
| 673 | 123 |  | 901 | 50 | 420.6 | 351.362 |
| 674 | 124 |  | 902 | 50 | 420.6 | 350.54 |
| 675 | 125 |  | 901 | 50 | 420.6 | 349.772 |
| 676 | 123 |  | 902 | 50 | 420.6 | 351.333 |
| 677 | 122 |  | 901 | 50 | 420.6 | 352.152 |
| 678 | 121 |  | 902 | 50 | 420.6 | 352.909 |
| 679 | 123 |  | 903 | 50 | 420.6 | 351.305 |
| 680 | 126 |  | 906 | 50 | 420.6 | 348.833 |
| 681 | 124 |  | 903 | 50 | 420.6 | 350.512 |
| 682 | 124 |  | 904 | 50 | 420.6 | 350.484 |
| 683 | 122 |  | 904 | 50 | 420.6 | 352.066 |
| 684 | 121 |  | 905 | 50 | 420.6 | 352.822 |
| 685 | 122 |  | 907 | 50 | 420.6 | 351.98 |
| 686 | 123 |  | 904 | 50 | 420.6 | 351.276 |
| 687 | 125 |  | 904 | 50 | 420.6 | 349.688 |
| 688 | 122 |  | 907 | 50 | 420.6 | 351.98 |
| 689 | 123 |  | 906 | 50 | 420.6 | 351.22 |
| 690 | 122 |  | 905 | 50 | 420.6 | 352.037 |
| 691 | 122 |  | 904 | 50 | 420.6 | 352.066 |
| 692 | 124 |  | 906 | 50 | 420.6 | 350.427 |
| 693 | 127 |  | 906 | 50 | 420.6 | 348.031 |
| 694 | 123 |  | 905 | 50 | 420.6 | 351.248 |
| 695 | 123 |  | 907 | 50 | 420.6 | 351.191 |
| 696 | 122 |  | 906 | 50 | 420.6 | 352.008 |
| 697 | 122 |  | 906 | 50 | 420.6 | 352.008 |
| 698 | 126 |  | 905 | 50 | 420.6 | 348.861 |
| 699 | 126 |  | 908 | 50 | 420.6 | 348.778 |
| 700 | 122 |  | 906 | 50 | 420.6 | 352.008 |
| 701 | 122 |  | 906 | 50 | 420.6 | 352.008 |
| 702 | 122 |  | 906 | 50 | 420.6 | 352.008 |
| 703 | 122 |  | 906 | 50 | 420.6 | 352.008 |
| 704 | 124 |  | 906 | 50 | 420.6 | 350.427 |
| 705 | 122 |  | 907 | 50 | 420.6 | 351.98 |
| 706 | 121 |  | 906 | 50 | 420.6 | 352.793 |
| 707 | 121 |  | 906 | 50 | 420.6 | 352.793 |
| 708 | 121 |  | 905 | 50 | 420.6 | 352.822 |
| 709 | 121 |  | 906 | 50 | 420.6 | 352.793 |
| 710 | 123 |  | 907 | 50 | 420.6 | 351.191 |
| 711 | 122 |  | 905 | 50 | 420.6 | 352.037 |
| 712 | 122 |  | 907 | 50 | 420.6 | 351.98 |
| 713 | 121 |  | 905 | 50 | 420.6 | 352.822 |
| 714 | 121 |  | 907 | 50 | 420.6 | 352.764 |
| 715 | 121 |  | 906 | 50 | 420.6 | 352.793 |
| 716 | 121 |  | 904 | 50 | 420.6 | 352.851 |
| 717 | 122 |  | 904 | 50 | 420.6 | 352.066 |
| 718 | 121 |  | 907 | 50 | 420.6 | 352.764 |
| 719 | 120 |  | 904 | 50 | 420.6 | 353.633 |
| 720 | 120 |  | 906 | 50 | 420.6 | 353.575 |
| 721 | 121 |  | 905 | 50 | 420.6 | 352.822 |
| 722 | 122 |  | 907 | 50 | 420.6 | 351.98 |
| 723 | 121 |  | 907 | 50 | 420.6 | 352.764 |
| 724 | 123 |  | 905 | 50 | 420.6 | 351.248 |
| 725 | 121 |  | 904 | 100 | 420.6 | 352.851 |
| 726 | 153 |  | 833 | 100 | 420.6 | 327.944 |
| 727 | 162 |  | 823 | 100 | 420.6 | 320.219 |
| 728 | 160 |  | 824 | 100 | 420.6 | 321.975 |
| 729 | 166 |  | 813 | 100 | 420.6 | 316.858 |
| 730 | 163 |  | 823 | 100 | 420.6 | 319.328 |
| 731 | 164 |  | 822 | 100 | 420.6 | 318.457 |
| 732 | 161 |  | 819 | 100 | 420.6 | 321.196 |
| 733 | 162 |  | 818 | 100 | 420.6 | 320.327 |
| 734 | 166 |  | 818 | 100 | 420.6 | 316.753 |
| 735 | 167 |  | 812 | 100 | 420.6 | 315.982 |
| 736 | 162 |  | 816 | 100 | 420.6 | 320.37 |
| 737 | 166 |  | 813 | 100 | 420.6 | 316.858 |
| 738 | 162 |  | 822 | 100 | 420.6 | 320.241 |
| 739 | 164 |  | 815 | 100 | 420.6 | 318.607 |
| 740 | 167 |  | 818 | 100 | 420.6 | 315.856 |
| 741 | 165 |  | 816 | 100 | 420.6 | 317.691 |
| 742 | 163 |  | 818 | 100 | 420.6 | 319.436 |
| 743 | 163 |  | 830 | 50 | 420.6 | 319.178 |
| 744 | 164 |  | 824 | 50 | 420.6 | 318.415 |
| 745 | 166 |  | 819 | 50 | 420.6 | 316.732 |
| 746 | 164 |  | 817 | 50 | 420.6 | 318.564 |
| 747 | 159 |  | 826 | 50 | 420.6 | 322.818 |
| 748 | 161 |  | 829 | 50 | 420.6 | 320.978 |
| 749 | 165 |  | 820 | 50 | 420.6 | 317.606 |
| 750 | 158 |  | 830 | 50 | 420.6 | 323.614 |
| 751 | 164 |  | 825 | 50 | 420.6 | 318.393 |
| 752 | 166 |  | 816 | 50 | 420.6 | 316.795 |
| 753 | 164 |  | 813 | 50 | 420.6 | 318.649 |
| 754 | 146 |  | 745 | 100 | 420.6 | 336.14 |
| 755 | 154 |  | 799 | 100 | 420.6 | 327.841 |
| 756 | 168 |  | 815 | 100 | 420.6 | 315.021 |
| 757 | 164 |  | 825 | 100 | 420.6 | 318.393 |
| 758 | 166 |  | 814 | 100 | 420.6 | 316.837 |
| 759 | 165 |  | 823 | 100 | 420.6 | 317.542 |
| 760 | 165 |  | 822 | 100 | 420.6 | 317.564 |
| 761 | 167 |  | 826 | 100 | 420.6 | 315.689 |
| 762 | 167 |  | 814 | 100 | 420.6 | 315.94 |
| 763 | 166 |  | 816 | 100 | 420.6 | 316.795 |
| 764 | 164 |  | 827 | 100 | 420.6 | 318.351 |
| 765 | 163 |  | 828 | 100 | 420.6 | 319.221 |
| 766 | 163 |  | 823 | 100 | 420.6 | 319.328 |
| 767 | 162 |  | 822 | 100 | 420.6 | 320.241 |
| 768 | 162 |  | 827 | 100 | 420.6 | 320.133 |
| 769 | 165 |  | 823 | 100 | 420.6 | 317.542 |
| 770 | 167 |  | 823 | 100 | 420.6 | 315.751 |
| 771 | 162 |  | 822 | 100 | 420.6 | 320.241 |
| 772 | 164 |  | 822 | 100 | 420.6 | 318.457 |
| 773 | 160 |  | 825 | 100 | 420.6 | 321.953 |
| 774 | 165 |  | 826 | 100 | 420.6 | 317.479 |
| 775 | 165 |  | 821 | 100 | 420.6 | 317.585 |
| 776 | 160 |  | 831 | 100 | 420.6 | 321.822 |
| 777 | 160 |  | 825 | 100 | 420.6 | 321.953 |
| 778 | 159 |  | 831 | 100 | 420.6 | 322.708 |
| 779 | 163 |  | 832 | 100 | 420.6 | 319.135 |
| 780 | 165 |  | 821 | 100 | 420.6 | 317.585 |
| 781 | 164 |  | 822 | 100 | 420.6 | 318.457 |
| 782 | 162 |  | 822 | 100 | 420.6 | 320.241 |
| 783 | 160 |  | 831 | 100 | 420.6 | 321.822 |
| 784 | 167 |  | 824 | 100 | 420.6 | 315.731 |
| 785 | 162 |  | 826 | 100 | 420.6 | 320.154 |
| 786 | 162 |  | 833 | 100 | 420.6 | 320.003 |
| 787 | 162 |  | 827 | 100 | 420.6 | 320.133 |
| 788 | 163 |  | 828 | 100 | 420.6 | 319.221 |
| 789 | 166 |  | 817 | 100 | 420.6 | 316.774 |
| 790 | 164 |  | 830 | 100 | 420.6 | 318.287 |
| 791 | 165 |  | 820 | 100 | 420.6 | 317.606 |
| 792 | 167 |  | 824 | 100 | 420.6 | 315.731 |
| 793 | 163 |  | 821 | 100 | 420.6 | 319.371 |
| 794 | 162 |  | 827 | 100 | 420.6 | 320.133 |
| 795 | 162 |  | 820 | 100 | 420.6 | 320.284 |
| 796 | 164 |  | 821 | 100 | 420.6 | 318.479 |
| 797 | 161 |  | 829 | 100 | 420.6 | 320.978 |
| 798 | 161 |  | 830 | 100 | 420.6 | 320.957 |
| 799 | 166 |  | 820 | 100 | 420.6 | 316.711 |
| 800 | 164 |  | 828 | 100 | 420.6 | 318.329 |
| 801 | 161 |  | 826 | 100 | 420.6 | 321.043 |
| 802 | 162 |  | 831 | 100 | 420.6 | 320.046 |
| 803 | 166 |  | 826 | 100 | 420.6 | 316.584 |
| 804 | 164 |  | 823 | 100 | 420.6 | 318.436 |
| 805 | 162 |  | 819 | 100 | 420.6 | 320.306 |
| 806 | 166 |  | 825 | 100 | 420.6 | 316.605 |
| 807 | 166 |  | 817 | 100 | 420.6 | 316.774 |
| 808 | 166 |  | 819 | 100 | 420.6 | 316.732 |
| 809 | 164 |  | 827 | 100 | 420.6 | 318.351 |
| 810 | 160 |  | 828 | 100 | 420.6 | 321.887 |
| 811 | 113 |  | 824 | 100 | 420.6 | 361.478 |
| 812 | 125 |  | 815 | 100 | 420.6 | 352.18 |
| 813 | 177 |  | 825 | 100 | 420.6 | 306.686 |
| 814 | 195 |  | 818 | 100 | 420.6 | 290.318 |
| 815 | 187 |  | 824 | 100 | 420.6 | 297.578 |
| 816 | 194 |  | 826 | 100 | 420.6 | 291.098 |
| 817 | 177 |  | 812 | 100 | 420.6 | 306.944 |
| 818 | 148 |  | 815 | 100 | 420.6 | 332.726 |
| 819 | 172 |  | 827 | 100 | 420.6 | 311.172 |
| 820 | 199 |  | 825 | 100 | 420.6 | 286.49 |
| 821 | 174 |  | 829 | 100 | 420.6 | 309.325 |
| 822 | 176 |  | 817 | 100 | 420.6 | 307.753 |
| 823 | 141 |  | 828 | 100 | 420.6 | 338.447 |
| 824 | 37 |  | 913 | 50 | 530.9 | 376.635 |
| 825 | 36 |  | 914 | 50 | 530.9 | 375.139 |
| 826 | 28 |  | 918 | 50 | 530.9 | 357.25 |
| 827 | 26 |  | 914 | 50 | 530.9 | 350.962 |
| 828 | 27 |  | 917 | 50 | 530.9 | 354.13 |
| 829 | 27 |  | 918 | 50 | 530.9 | 354 |
| 830 | 26 |  | 913 | 50 | 530.9 | 351.096 |
| 831 | 27 |  | 917 | 50 | 530.9 | 354.13 |
| 832 | 27 |  | 916 | 50 | 530.9 | 354.259 |
| 833 | 27 |  | 916 | 50 | 530.9 | 354.259 |
| 834 | 26 |  | 916 | 50 | 530.9 | 350.692 |
| 835 | 27 |  | 918 | 50 | 530.9 | 354 |
| 836 | 27 |  | 917 | 50 | 530.9 | 354.13 |
| 837 | 28 |  | 917 | 50 | 530.9 | 357.375 |
| 838 | 27 |  | 916 | 50 | 530.9 | 354.259 |
| 839 | 27 |  | 914 | 50 | 530.9 | 354.519 |
| 840 | 26 |  | 916 | 50 | 530.9 | 350.692 |
| 841 | 27 |  | 917 | 50 | 530.9 | 354.13 |
| 842 | 27 |  | 917 | 50 | 530.9 | 354.13 |
| 843 | 90 |  | 913 | 50 | 530.9 | 374.494 |
| 844 | 72 |  | 909 | 50 | 530.9 | 383.812 |
| 845 | 36 |  | 911 | 50 | 530.9 | 375.431 |
| 846 | 36 |  | 913 | 50 | 530.9 | 375.236 |
| 847 | 37 |  | 911 | 50 | 530.9 | 376.824 |
| 848 | 27 |  | 916 | 50 | 530.9 | 354.259 |
| 849 | 36 |  | 913 | 50 | 530.9 | 375.236 |
| 850 | 36 |  | 910 | 50 | 530.9 | 375.528 |
| 851 | 36 |  | 913 | 50 | 530.9 | 375.236 |
| 852 | 55 |  | 913 | 50 | 530.9 | 386.9 |
| 853 | 73 |  | 914 | 50 | 530.9 | 383.178 |
| 854 | 72 |  | 913 | 50 | 530.9 | 383.618 |
| 855 | 47 |  | 913 | 50 | 530.9 | 385.011 |
| 856 | 37 |  | 914 | 50 | 530.9 | 376.541 |
| 857 | 36 |  | 913 | 50 | 530.9 | 375.236 |
| 858 | 46 |  | 913 | 50 | 530.9 | 384.533 |
| 859 | 55 |  | 914 | 50 | 530.9 | 386.836 |
| 860 | 56 |  | 913 | 50 | 530.9 | 386.938 |
| 861 | 74 |  | 913 | 50 | 530.9 | 382.818 |
| 862 | 56 |  | 914 | 50 | 530.9 | 386.875 |
| 863 | 56 |  | 913 | 50 | 530.9 | 386.938 |
| 864 | 55 |  | 914 | 50 | 530.9 | 386.836 |
| 865 | 56 |  | 915 | 50 | 530.9 | 386.812 |
| 866 | 56 |  | 915 | 50 | 530.9 | 386.812 |
| 867 | 27 |  | 917 | 50 | 530.9 | 354.13 |
| 868 | 27 |  | 918 | 50 | 530.9 | 354 |
| 869 | 46 |  | 917 | 50 | 530.9 | 384.228 |
| 870 | 65 |  | 918 | 50 | 530.9 | 385.569 |
| 871 | 47 |  | 918 | 50 | 530.9 | 384.638 |
| 872 | 47 |  | 917 | 50 | 530.9 | 384.713 |
| 873 | 38 |  | 918 | 50 | 530.9 | 377.447 |
| 874 | 29 |  | 917 | 50 | 530.9 | 360.328 |
| 875 | 28 |  | 918 | 50 | 530.9 | 357.25 |
| 876 | 27 |  | 919 | 50 | 530.9 | 353.87 |
| 877 | 27 |  | 919 | 50 | 530.9 | 353.87 |
| 878 | 46 |  | 919 | 50 | 530.9 | 384.076 |
| 879 | 38 |  | 917 | 50 | 530.9 | 377.539 |
| 880 | 27 |  | 917 | 50 | 530.9 | 354.13 |
| 881 | 27 |  | 918 | 50 | 530.9 | 354 |
| 882 | 28 |  | 920 | 50 | 530.9 | 357 |
| 883 | 27 |  | 916 | 50 | 530.9 | 354.259 |
| 884 | 27 |  | 916 | 50 | 530.9 | 354.259 |
| 885 | 27 |  | 919 | 50 | 530.9 | 353.87 |
| 886 | 27 |  | 918 | 50 | 530.9 | 354 |
| 887 | 27 |  | 920 | 50 | 530.9 | 353.741 |
| 888 | 26 |  | 919 | 50 | 530.9 | 350.288 |
| 889 | 27 |  | 919 | 50 | 530.9 | 353.87 |
| 890 | 27 |  | 917 | 50 | 530.9 | 354.13 |
| 891 | 27 |  | 920 | 50 | 530.9 | 353.741 |
| 892 | 28 |  | 919 | 50 | 530.9 | 357.125 |
| 893 | 26 |  | 920 | 50 | 530.9 | 350.154 |
| 894 | 28 |  | 918 | 50 | 530.9 | 357.25 |
| 895 | 27 |  | 919 | 50 | 530.9 | 353.87 |
| 896 | 28 |  | 920 | 50 | 530.9 | 357 |
| 897 | 27 |  | 922 | 50 | 530.9 | 353.481 |
| 898 | 27 |  | 920 | 50 | 530.9 | 353.741 |
| 899 | 27 |  | 918 | 50 | 530.9 | 354 |
| 900 | 27 |  | 921 | 50 | 530.9 | 353.611 |
| 901 | 27 |  | 919 | 50 | 530.9 | 353.87 |
| 902 | 27 |  | 917 | 50 | 530.9 | 354.13 |
| 903 | 28 |  | 920 | 50 | 530.9 | 357 |
| 904 | 28 |  | 920 | 50 | 530.9 | 357 |
| 905 | 65 |  | 919 | 50 | 530.9 | 385.515 |
| 906 | 82 |  | 918 | 50 | 530.9 | 378.817 |
| 907 | 26 |  | 918 | 50 | 530.9 | 350.423 |
| 908 | 27 |  | 922 | 50 | 530.9 | 353.481 |
| 909 | 26 |  | 919 | 50 | 530.9 | 350.288 |
| 910 | 27 |  | 920 | 50 | 530.9 | 353.741 |
| 911 | 26 |  | 923 | 50 | 530.9 | 349.75 |
| 912 | 39 |  | 919 | 50 | 530.9 | 378.526 |
| 913 | 47 |  | 920 | 50 | 530.9 | 384.489 |
| 914 | 38 |  | 920 | 50 | 530.9 | 377.263 |
| 915 | 70 |  | 867 | 50 | 530.9 | 386.65 |
| 916 | 87 |  | 852 | 50 | 530.9 | 378.724 |
| 917 | 79 |  | 847 | 50 | 530.9 | 383.475 |
| 918 | 82 |  | 839 | 50 | 530.9 | 382.189 |
| 919 | 79 |  | 842 | 50 | 530.9 | 383.696 |
| 920 | 84 |  | 843 | 50 | 530.9 | 380.875 |
| 921 | 82 |  | 836 | 50 | 530.9 | 382.317 |
| 922 | 93 |  | 837 | 50 | 530.9 | 375.5 |
| 923 | 90 |  | 840 | 50 | 530.9 | 377.333 |
| 924 | 85 |  | 838 | 50 | 530.9 | 380.494 |
| 925 | 94 |  | 840 | 50 | 530.9 | 374.723 |
| 926 | 94 |  | 837 | 100 | 530.9 | 374.835 |
| 927 | 95 |  | 843 | 100 | 530.9 | 373.942 |
| 928 | 103 |  | 839 | 100 | 530.9 | 368.49 |
| 929 | 93 |  | 834 | 100 | 530.9 | 375.613 |
| 930 | 77 |  | 830 | 100 | 530.9 | 385.273 |
| 931 | 84 |  | 848 | 100 | 530.9 | 380.667 |
| 932 | 95 |  | 836 | 100 | 530.9 | 374.2 |
| 933 | 101 |  | 840 | 100 | 530.9 | 369.891 |
| 934 | 102 |  | 842 | 100 | 530.9 | 369.108 |
| 935 | 100 |  | 843 | 100 | 530.9 | 370.495 |
| 936 | 97 |  | 844 | 100 | 530.9 | 372.546 |
| 937 | 101 |  | 841 | 100 | 530.9 | 369.856 |
| 938 | 95 |  | 843 | 100 | 530.9 | 373.942 |
| 939 | 87 |  | 833 | 100 | 530.9 | 379.489 |
| 940 | 102 |  | 834 | 100 | 530.9 | 369.382 |
| 941 | 94 |  | 839 | 100 | 530.9 | 374.761 |
| 942 | 87 |  | 844 | 100 | 530.9 | 379.046 |
| 943 | 93 |  | 844 | 100 | 530.9 | 375.237 |
| 944 | 92 |  | 841 | 100 | 530.9 | 376.005 |
| 945 | 93 |  | 842 | 100 | 530.9 | 375.312 |
| 946 | 100 |  | 842 | 100 | 530.9 | 370.53 |
| 947 | 92 |  | 847 | 100 | 530.9 | 375.777 |
| 948 | 85 |  | 842 | 100 | 530.9 | 380.329 |
| 949 | 94 |  | 834 | 100 | 530.9 | 374.947 |
| 950 | 84 |  | 838 | 100 | 530.9 | 381.083 |
| 951 | 81 |  | 840 | 100 | 530.9 | 382.704 |
| 952 | 81 |  | 850 | 100 | 530.9 | 382.272 |
| 953 | 84 |  | 839 | 100 | 530.9 | 381.042 |
| 954 | 92 |  | 837 | 100 | 530.9 | 376.158 |
| 955 | 83 |  | 844 | 100 | 530.9 | 381.41 |
| 956 | 76 |  | 840 | 100 | 530.9 | 385.316 |
| 957 | 109 |  | 844 | 100 | 530.9 | 363.899 |
| 958 | 117 |  | 840 | 100 | 530.9 | 357.872 |
| 959 | 110 |  | 854 | 100 | 530.9 | 362.827 |
| 960 | 114 |  | 841 | 100 | 530.9 | 360.18 |
| 961 | 91 |  | 835 | 100 | 530.9 | 376.885 |
| 962 | 96 |  | 840 | 100 | 530.9 | 373.375 |
| 963 | 99 |  | 845 | 100 | 530.9 | 371.126 |
| 964 | 101 |  | 841 | 100 | 530.9 | 369.856 |
| 965 | 89 |  | 847 | 100 | 530.9 | 377.691 |
| 966 | 90 |  | 839 | 100 | 530.9 | 377.372 |
| 967 | 109 |  | 841 | 100 | 530.9 | 363.995 |
| 968 | 116 |  | 845 | 100 | 530.9 | 358.504 |
| 969 | 92 |  | 841 | 100 | 530.9 | 376.005 |
| 970 | 79 |  | 835 | 100 | 530.9 | 384.006 |
| 971 | 75 |  | 839 | 100 | 530.9 | 385.847 |
| 972 | 74 |  | 843 | 100 | 530.9 | 386.128 |
| 973 | 80 |  | 844 | 100 | 530.9 | 383.075 |
| 974 | 83 |  | 843 | 100 | 530.9 | 381.452 |
| 975 | 92 |  | 837 | 100 | 530.9 | 376.158 |
| 976 | 94 |  | 836 | 100 | 530.9 | 374.872 |
| 977 | 90 |  | 837 | 100 | 530.9 | 377.45 |
| 978 | 128 |  | 843 | 100 | 530.9 | 348.949 |
| 979 | 131 |  | 843 | 100 | 530.9 | 346.477 |
| 980 | 108 |  | 844 | 100 | 530.9 | 364.648 |
| 981 | 86 |  | 838 | 100 | 530.9 | 379.895 |
| 982 | 102 |  | 843 | 100 | 530.9 | 369.074 |
| 983 | 85 |  | 841 | 100 | 530.9 | 380.371 |
| 984 | 84 |  | 847 | 100 | 530.9 | 380.708 |
| 985 | 77 |  | 838 | 100 | 530.9 | 384.909 |
| 986 | 99 |  | 846 | 100 | 530.9 | 371.091 |
| 987 | 111 |  | 841 | 100 | 530.9 | 362.482 |
| 988 | 101 |  | 846 | 100 | 530.9 | 369.683 |
| 989 | 93 |  | 849 | 100 | 530.9 | 375.048 |
| 990 | 101 |  | 847 | 100 | 530.9 | 369.649 |
| 991 | 101 |  | 840 | 100 | 530.9 | 369.891 |
| 992 | 91 |  | 839 | 100 | 530.9 | 376.731 |
| 993 | 92 |  | 845 | 100 | 530.9 | 375.853 |
| 994 | 87 |  | 846 | 100 | 530.9 | 378.966 |
| 995 | 95 |  | 847 | 100 | 530.9 | 373.795 |
| 996 | 99 |  | 847 | 100 | 530.9 | 371.056 |
| 997 | 94 |  | 836 | 100 | 530.9 | 374.872 |
| 998 | 101 |  | 844 | 100 | 530.9 | 369.752 |
| 999 | 97 |  | 840 | 100 | 530.9 | 372.691 |
| 1000 | 77 |  | 839 | 100 | 530.9 | 384.864 |
| 1001 | 88 |  | 841 | 100 | 530.9 | 378.551 |
| 1002 | 89 |  | 854 | 100 | 530.9 | 377.416 |
| 1003 | 96 |  | 837 | 100 | 530.9 | 373.484 |
| 1004 | 95 |  | 837 | 100 | 530.9 | 374.163 |
| 1005 | 100 |  | 838 | 100 | 530.9 | 370.67 |
| 1006 | 90 |  | 845 | 100 | 530.9 | 377.139 |
| 1007 | 93 |  | 838 | 100 | 530.9 | 375.462 |
| 1008 | 98 |  | 850 | 100 | 530.9 | 371.643 |
| 1009 | 81 |  | 837 | 100 | 530.9 | 382.833 |
| 1010 | 74 |  | 841 | 100 | 530.9 | 386.223 |
| 1011 | 76 |  | 838 | 100 | 530.9 | 385.408 |
| 1012 | 82 |  | 843 | 100 | 530.9 | 382.018 |
| 1013 | 79 |  | 848 | 100 | 530.9 | 383.43 |
| 1014 | 76 |  | 837 | 100 | 530.9 | 385.454 |